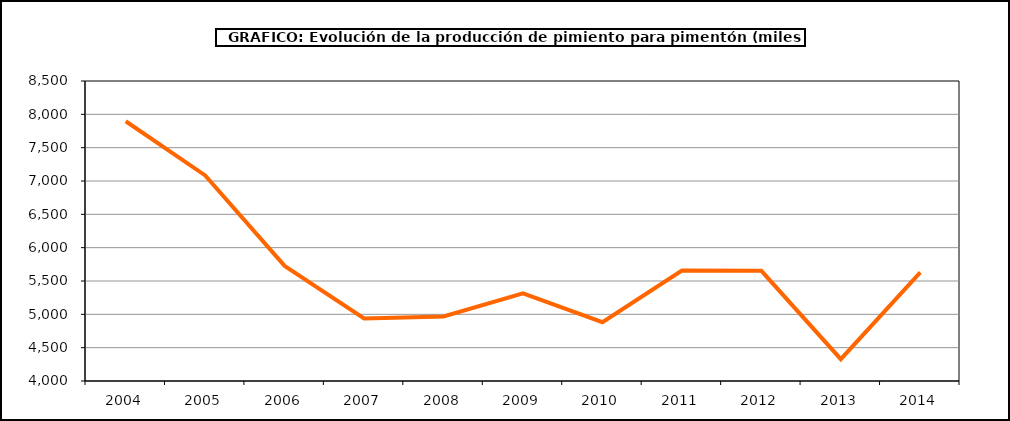
| Category | Producción |
|---|---|
| 2004.0 | 7896 |
| 2005.0 | 7084 |
| 2006.0 | 5727 |
| 2007.0 | 4939 |
| 2008.0 | 4969 |
| 2009.0 | 5314 |
| 2010.0 | 4882 |
| 2011.0 | 5658 |
| 2012.0 | 5652 |
| 2013.0 | 4327 |
| 2014.0 | 5630 |